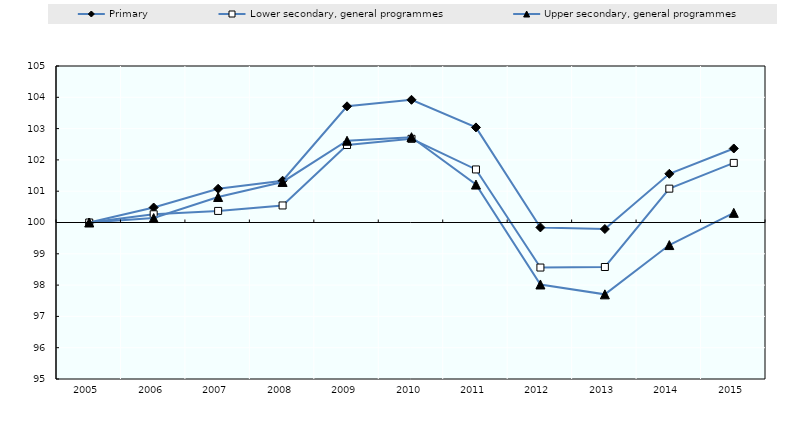
| Category | Primary   | Lower secondary, general programmes  | Upper secondary, general programmes |
|---|---|---|---|
| 2005.0 | 100 | 100 | 100 |
| 2006.0 | 100.479 | 100.263 | 100.143 |
| 2007.0 | 101.077 | 100.37 | 100.816 |
| 2008.0 | 101.335 | 100.544 | 101.296 |
| 2009.0 | 103.712 | 102.476 | 102.612 |
| 2010.0 | 103.92 | 102.674 | 102.726 |
| 2011.0 | 103.038 | 101.695 | 101.212 |
| 2012.0 | 99.843 | 98.561 | 98.02 |
| 2013.0 | 99.792 | 98.578 | 97.704 |
| 2014.0 | 101.556 | 101.082 | 99.279 |
| 2015.0 | 102.365 | 101.904 | 100.308 |